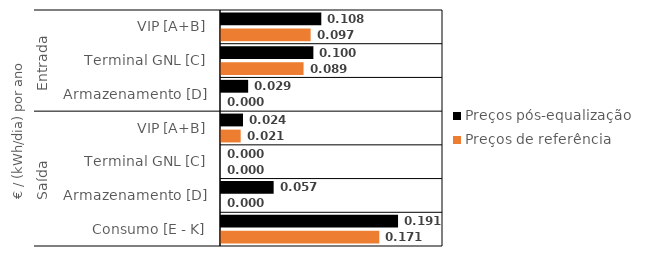
| Category | Preços pós-equalização | Preços de referência |
|---|---|---|
| 0 | 0.108 | 0.097 |
| 1 | 0.1 | 0.089 |
| 2 | 0.029 | 0 |
| 3 | 0.024 | 0.021 |
| 4 | 0 | 0 |
| 5 | 0.057 | 0 |
| 6 | 0.191 | 0.171 |